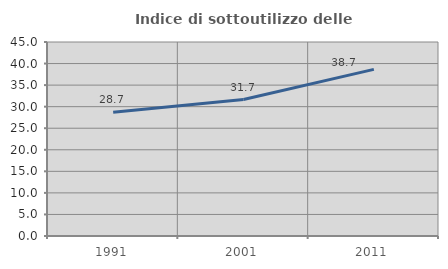
| Category | Indice di sottoutilizzo delle abitazioni  |
|---|---|
| 1991.0 | 28.687 |
| 2001.0 | 31.66 |
| 2011.0 | 38.654 |